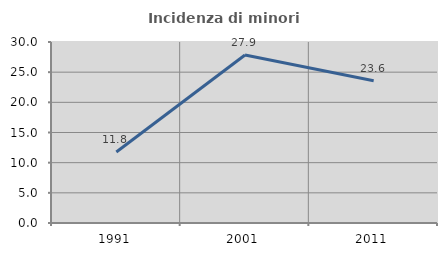
| Category | Incidenza di minori stranieri |
|---|---|
| 1991.0 | 11.765 |
| 2001.0 | 27.857 |
| 2011.0 | 23.565 |